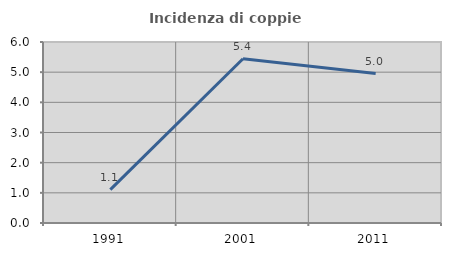
| Category | Incidenza di coppie miste |
|---|---|
| 1991.0 | 1.105 |
| 2001.0 | 5.446 |
| 2011.0 | 4.955 |